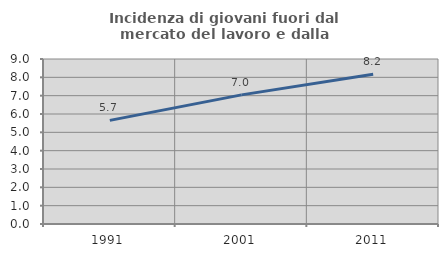
| Category | Incidenza di giovani fuori dal mercato del lavoro e dalla formazione  |
|---|---|
| 1991.0 | 5.653 |
| 2001.0 | 7.042 |
| 2011.0 | 8.169 |